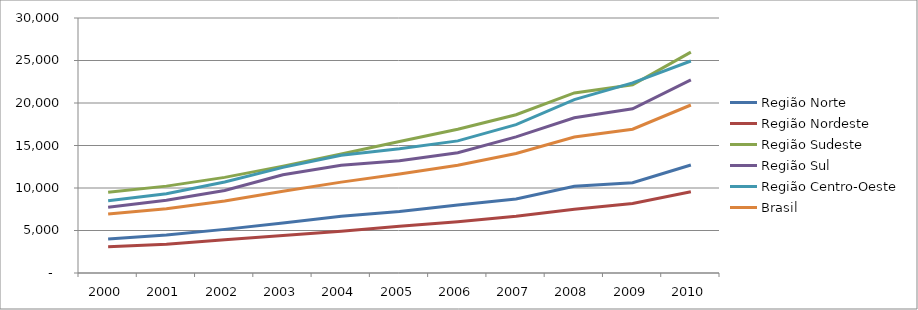
| Category | Região Norte | Região Nordeste | Região Sudeste | Região Sul | Região Centro-Oeste | Brasil |
|---|---|---|---|---|---|---|
| 2000.0 | 4008 | 3075.47 | 9498.05 | 7737.01 | 8500.24 | 6946.35 |
| 2001.0 | 4467.15 | 3382.14 | 10220.57 | 8547.4 | 9333.99 | 7553.79 |
| 2002.0 | 5132.32 | 3922.43 | 11251.5 | 9700.14 | 10713.4 | 8462.44 |
| 2003.0 | 5890.48 | 4397.72 | 12570.95 | 11560.33 | 12430 | 9611.21 |
| 2004.0 | 6679.49 | 4899.07 | 14008.84 | 12676.44 | 13844.9 | 10691.89 |
| 2005.0 | 7241.49 | 5498.83 | 15468.74 | 13205.97 | 14605.73 | 11658.1 |
| 2006.0 | 7987.81 | 6028.09 | 16911.7 | 14156.15 | 15545.74 | 12686.6 |
| 2007.0 | 8706.39 | 6663.56 | 18615.63 | 16020.11 | 17457.91 | 14056.26 |
| 2008.0 | 10216.38 | 7487.49 | 21182.65 | 18257.34 | 20398.18 | 15991.55 |
| 2009.0 | 10625.76 | 8167.74 | 22147.13 | 19324.73 | 22364.48 | 16917.62 |
| 2010.0 | 12702.03 | 9560.72 | 25984.41 | 22720.89 | 24939.12 | 19763.93 |